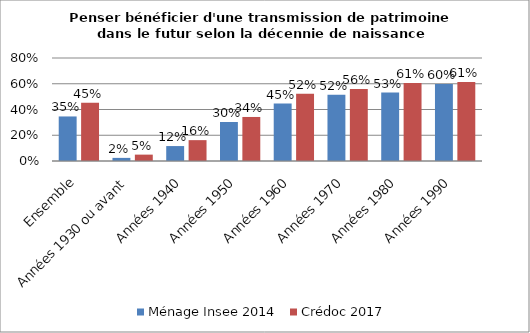
| Category | Ménage Insee 2014 | Crédoc 2017 |
|---|---|---|
| Ensemble | 0.346 | 0.452 |
| Années 1930 ou avant | 0.024 | 0.05 |
| Années 1940 | 0.116 | 0.162 |
| Années 1950 | 0.303 | 0.342 |
| Années 1960 | 0.446 | 0.522 |
| Années 1970 | 0.515 | 0.56 |
| Années 1980 | 0.532 | 0.605 |
| Années 1990 | 0.599 | 0.613 |